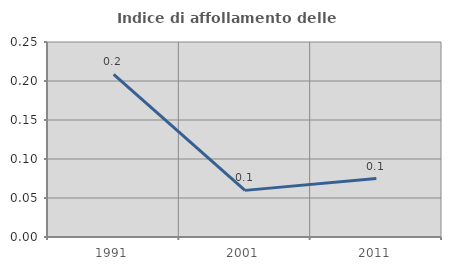
| Category | Indice di affollamento delle abitazioni  |
|---|---|
| 1991.0 | 0.208 |
| 2001.0 | 0.06 |
| 2011.0 | 0.075 |